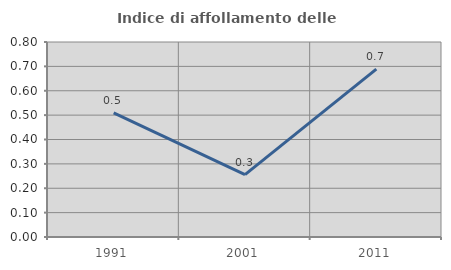
| Category | Indice di affollamento delle abitazioni  |
|---|---|
| 1991.0 | 0.509 |
| 2001.0 | 0.256 |
| 2011.0 | 0.689 |